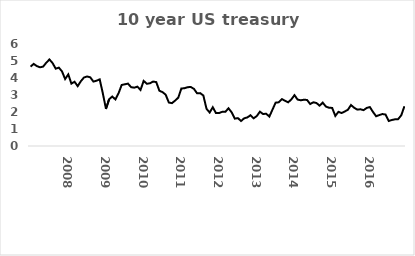
| Category | Series 0 |
|---|---|
| nan | 4.67 |
| nan | 4.83 |
| nan | 4.7 |
| nan | 4.63 |
| nan | 4.67 |
| nan | 4.9 |
| nan | 5.09 |
| nan | 4.88 |
| nan | 4.55 |
| nan | 4.61 |
| nan | 4.39 |
| nan | 3.94 |
| 2008.0 | 4.21 |
| nan | 3.67 |
| nan | 3.78 |
| nan | 3.52 |
| nan | 3.81 |
| nan | 4.03 |
| nan | 4.09 |
| nan | 4.04 |
| nan | 3.79 |
| nan | 3.84 |
| nan | 3.92 |
| nan | 3.1 |
| 2009.0 | 2.18 |
| nan | 2.75 |
| nan | 2.91 |
| nan | 2.74 |
| nan | 3.1 |
| nan | 3.59 |
| nan | 3.63 |
| nan | 3.67 |
| nan | 3.46 |
| nan | 3.43 |
| nan | 3.49 |
| nan | 3.3 |
| 2010.0 | 3.83 |
| nan | 3.66 |
| nan | 3.69 |
| nan | 3.79 |
| nan | 3.76 |
| nan | 3.25 |
| nan | 3.17 |
| nan | 3.02 |
| nan | 2.56 |
| nan | 2.52 |
| nan | 2.67 |
| nan | 2.84 |
| 2011.0 | 3.38 |
| nan | 3.4 |
| nan | 3.46 |
| nan | 3.47 |
| nan | 3.36 |
| nan | 3.1 |
| nan | 3.11 |
| nan | 2.97 |
| nan | 2.19 |
| nan | 1.97 |
| nan | 2.28 |
| nan | 1.94 |
| 2012.0 | 1.94 |
| nan | 2.01 |
| nan | 2.01 |
| nan | 2.22 |
| nan | 1.98 |
| nan | 1.61 |
| nan | 1.64 |
| nan | 1.47 |
| nan | 1.63 |
| nan | 1.68 |
| nan | 1.81 |
| nan | 1.63 |
| 2013.0 | 1.76 |
| nan | 2.02 |
| nan | 1.88 |
| nan | 1.9 |
| nan | 1.73 |
| nan | 2.14 |
| nan | 2.55 |
| nan | 2.57 |
| nan | 2.76 |
| nan | 2.66 |
| nan | 2.57 |
| nan | 2.74 |
| 2014.0 | 2.99 |
| nan | 2.73 |
| nan | 2.69 |
| nan | 2.72 |
| nan | 2.71 |
| nan | 2.47 |
| nan | 2.57 |
| nan | 2.53 |
| nan | 2.37 |
| nan | 2.55 |
| nan | 2.32 |
| nan | 2.25 |
| 2015.0 | 2.24 |
| nan | 1.77 |
| nan | 2.01 |
| nan | 1.94 |
| nan | 2.03 |
| nan | 2.13 |
| nan | 2.41 |
| nan | 2.25 |
| nan | 2.14 |
| nan | 2.16 |
| nan | 2.11 |
| nan | 2.24 |
| 2016.0 | 2.29 |
| nan | 2 |
| nan | 1.75 |
| nan | 1.82 |
| nan | 1.88 |
| nan | 1.85 |
| nan | 1.47 |
| nan | 1.53 |
| nan | 1.57 |
| nan | 1.58 |
| nan | 1.81 |
| nan | 2.34 |